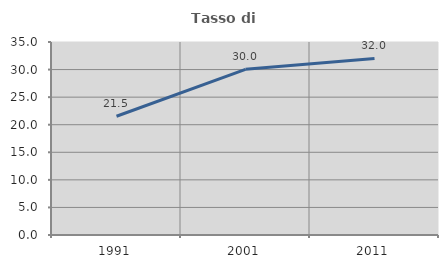
| Category | Tasso di occupazione   |
|---|---|
| 1991.0 | 21.538 |
| 2001.0 | 30.037 |
| 2011.0 | 32.014 |